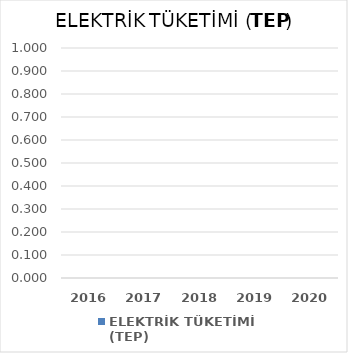
| Category | ELEKTRİK TÜKETİMİ (TEP) | Series 1 | Series 2 |
|---|---|---|---|
| 2016.0 | 0 |  |  |
| 2017.0 | 0 |  |  |
| 2018.0 | 0 |  |  |
| 2019.0 | 0 |  |  |
| 2020.0 | 0 |  |  |